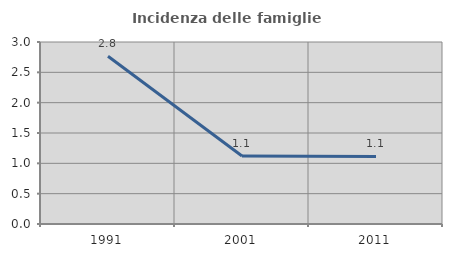
| Category | Incidenza delle famiglie numerose |
|---|---|
| 1991.0 | 2.766 |
| 2001.0 | 1.12 |
| 2011.0 | 1.114 |